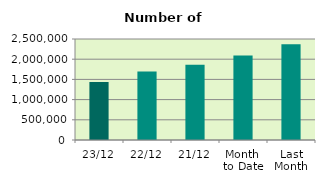
| Category | Series 0 |
|---|---|
| 23/12 | 1438060 |
| 22/12 | 1695548 |
| 21/12 | 1864384 |
| Month 
to Date | 2091876.471 |
| Last
Month | 2367033.455 |